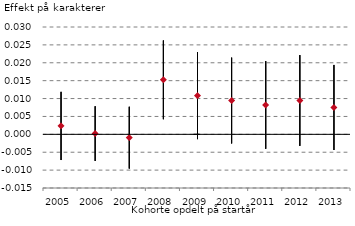
| Category | Serie 1 | Serie 2 | Serie 3 |
|---|---|---|---|
| 2005.0 | 0.012 | -0.007 | 0.002 |
| 2006.0 | 0.008 | -0.007 | 0 |
| 2007.0 | 0.008 | -0.01 | -0.001 |
| 2008.0 | 0.026 | 0.004 | 0.015 |
| 2009.0 | 0.023 | -0.001 | 0.011 |
| 2010.0 | 0.021 | -0.003 | 0.009 |
| 2011.0 | 0.02 | -0.004 | 0.008 |
| 2012.0 | 0.022 | -0.003 | 0.009 |
| 2013.0 | 0.019 | -0.004 | 0.008 |